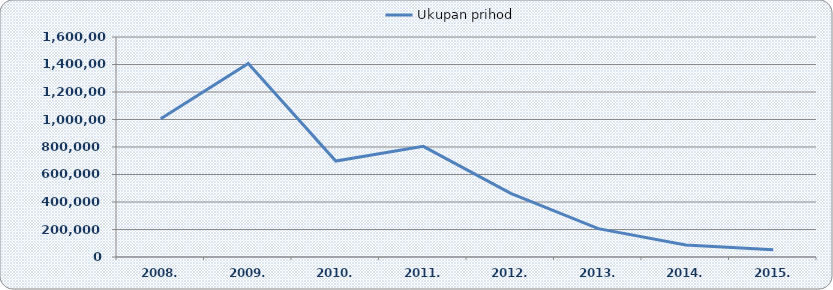
| Category | Ukupan prihod |
|---|---|
| 2008. | 1005278 |
| 2009. | 1407621 |
| 2010. | 697836 |
| 2011. | 804974 |
| 2012. | 463152 |
| 2013. | 206168 |
| 2014. | 87879 |
| 2015. | 53307 |